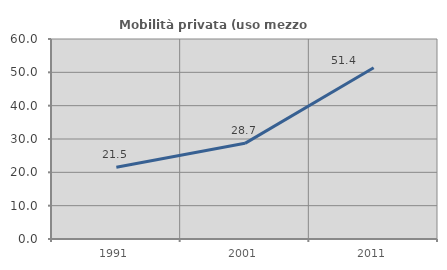
| Category | Mobilità privata (uso mezzo privato) |
|---|---|
| 1991.0 | 21.527 |
| 2001.0 | 28.698 |
| 2011.0 | 51.39 |